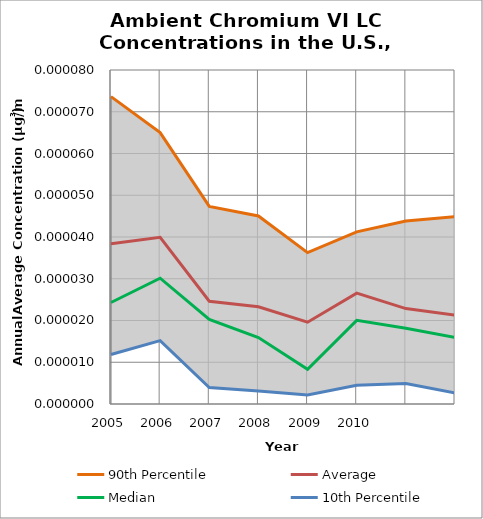
| Category | 90th Percentile | Average | Median | 10th Percentile |
|---|---|---|---|---|
| 2005.0 | 0 | 0 | 0 | 0 |
| 2006.0 | 0 | 0 | 0 | 0 |
| 2007.0 | 0 | 0 | 0 | 0 |
| 2008.0 | 0 | 0 | 0 | 0 |
| 2009.0 | 0 | 0 | 0 | 0 |
| 2010.0 | 0 | 0 | 0 | 0 |
| 2011.0 | 0 | 0 | 0 | 0 |
| 2012.0 | 0 | 0 | 0 | 0 |